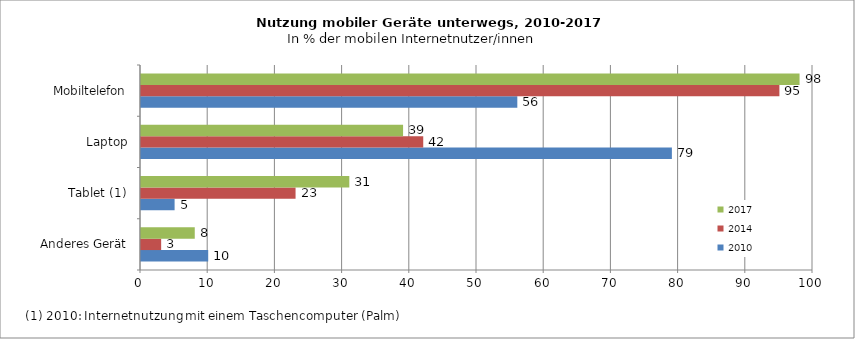
| Category | 2010 | 2014 | 2017 |
|---|---|---|---|
| Anderes Gerät | 10 | 3 | 8 |
| Tablet (1) | 5 | 23 | 31 |
| Laptop | 79 | 42 | 39 |
| Mobiltelefon | 56 | 95 | 98 |